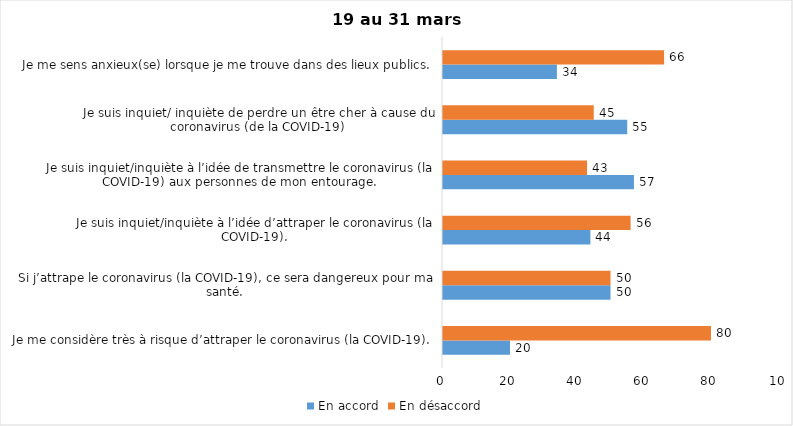
| Category | En accord | En désaccord |
|---|---|---|
| Je me considère très à risque d’attraper le coronavirus (la COVID-19). | 20 | 80 |
| Si j’attrape le coronavirus (la COVID-19), ce sera dangereux pour ma santé. | 50 | 50 |
| Je suis inquiet/inquiète à l’idée d’attraper le coronavirus (la COVID-19). | 44 | 56 |
| Je suis inquiet/inquiète à l’idée de transmettre le coronavirus (la COVID-19) aux personnes de mon entourage. | 57 | 43 |
| Je suis inquiet/ inquiète de perdre un être cher à cause du coronavirus (de la COVID-19) | 55 | 45 |
| Je me sens anxieux(se) lorsque je me trouve dans des lieux publics. | 34 | 66 |